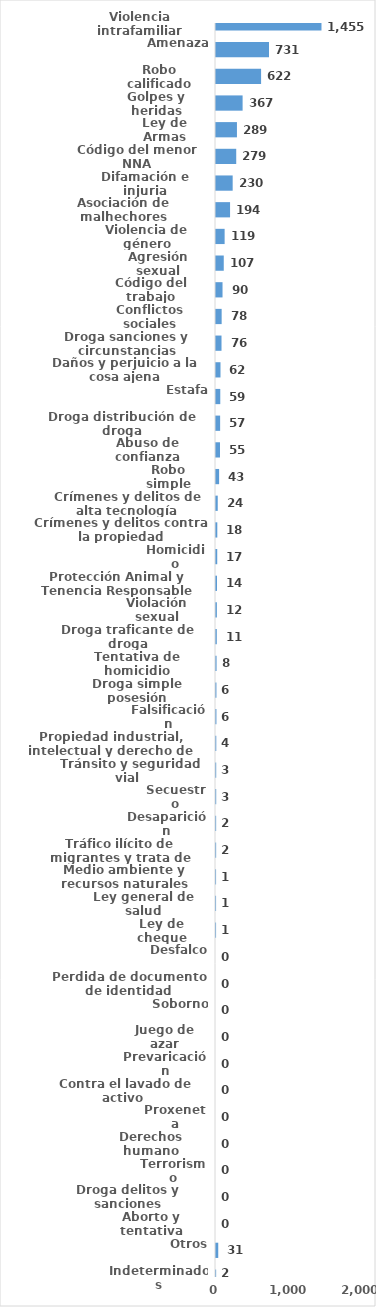
| Category | Series 0 |
|---|---|
| Violencia intrafamiliar | 1455 |
| Amenaza | 731 |
| Robo calificado | 622 |
| Golpes y heridas | 367 |
| Ley de Armas | 289 |
| Código del menor NNA | 279 |
| Difamación e injuria | 230 |
| Asociación de malhechores | 194 |
| Violencia de género | 119 |
| Agresión sexual | 107 |
| Código del trabajo | 90 |
| Conflictos sociales | 78 |
| Droga sanciones y circunstancias agravantes | 76 |
| Daños y perjuicio a la cosa ajena | 62 |
| Estafa | 59 |
| Droga distribución de droga | 57 |
| Abuso de confianza | 55 |
| Robo simple | 43 |
| Crímenes y delitos de alta tecnología | 24 |
| Crímenes y delitos contra la propiedad | 18 |
| Homicidio | 17 |
| Protección Animal y Tenencia Responsable | 14 |
| Violación sexual | 12 |
| Droga traficante de droga | 11 |
| Tentativa de homicidio | 8 |
| Droga simple posesión | 6 |
| Falsificación | 6 |
| Propiedad industrial, intelectual y derecho de autor | 4 |
| Tránsito y seguridad vial  | 3 |
| Secuestro | 3 |
| Desaparición | 2 |
| Tráfico ilícito de migrantes y trata de personas | 2 |
| Medio ambiente y recursos naturales | 1 |
| Ley general de salud | 1 |
| Ley de cheque | 1 |
| Desfalco | 0 |
| Perdida de documento de identidad | 0 |
| Soborno | 0 |
| Juego de azar | 0 |
| Prevaricación | 0 |
| Contra el lavado de activo  | 0 |
| Proxeneta | 0 |
| Derechos humano | 0 |
| Terrorismo | 0 |
| Droga delitos y sanciones | 0 |
| Aborto y tentativa | 0 |
| Otros | 31 |
| Indeterminados | 2 |